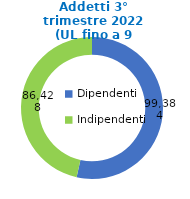
| Category | Series 0 |
|---|---|
| Dipendenti | 99384 |
| Indipendenti | 86428 |